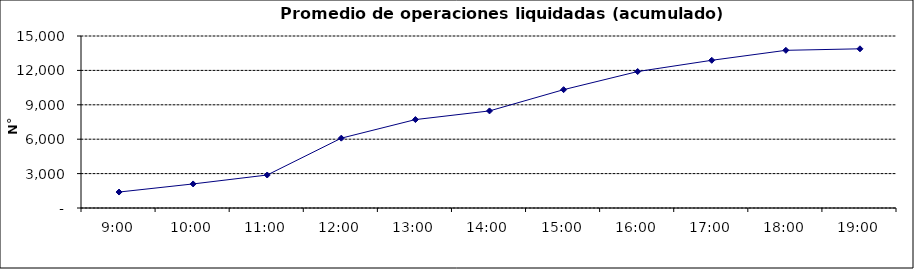
| Category | Promedio Op.Liquidadas (acumulado) |
|---|---|
| 0.375 | 1391.864 |
| 0.4166666666666667 | 2098.636 |
| 0.4583333333333333 | 2877.5 |
| 0.5 | 6089.864 |
| 0.5416666666666666 | 7709.909 |
| 0.5833333333333334 | 8466.773 |
| 0.625 | 10320.227 |
| 0.6666666666666666 | 11900.364 |
| 0.7083333333333334 | 12881.727 |
| 0.75 | 13750.909 |
| 0.7916666666666666 | 13883.773 |